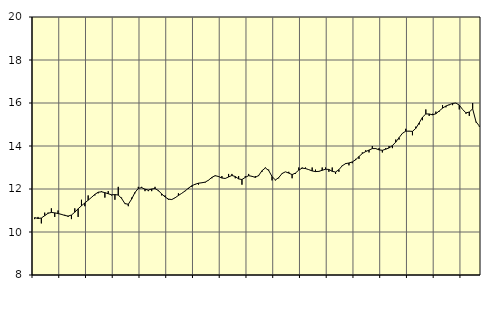
| Category | Piggar | Utbildning, SNI 85 |
|---|---|---|
| nan | 10.6 | 10.67 |
| 87.0 | 10.7 | 10.63 |
| 87.0 | 10.4 | 10.65 |
| 87.0 | 10.9 | 10.76 |
| nan | 10.9 | 10.87 |
| 88.0 | 11.1 | 10.91 |
| 88.0 | 10.7 | 10.89 |
| 88.0 | 11 | 10.86 |
| nan | 10.8 | 10.82 |
| 89.0 | 10.8 | 10.77 |
| 89.0 | 10.7 | 10.74 |
| 89.0 | 10.6 | 10.79 |
| nan | 11.1 | 10.92 |
| 90.0 | 10.7 | 11.08 |
| 90.0 | 11.5 | 11.22 |
| 90.0 | 11.2 | 11.35 |
| nan | 11.7 | 11.48 |
| 91.0 | 11.6 | 11.61 |
| 91.0 | 11.7 | 11.75 |
| 91.0 | 11.8 | 11.85 |
| nan | 11.9 | 11.87 |
| 92.0 | 11.6 | 11.83 |
| 92.0 | 11.9 | 11.78 |
| 92.0 | 11.7 | 11.73 |
| nan | 11.5 | 11.74 |
| 93.0 | 12.1 | 11.72 |
| 93.0 | 11.6 | 11.56 |
| 93.0 | 11.3 | 11.32 |
| nan | 11.2 | 11.29 |
| 94.0 | 11.6 | 11.53 |
| 94.0 | 11.8 | 11.84 |
| 94.0 | 12.1 | 12.03 |
| nan | 12.1 | 12.06 |
| 95.0 | 11.9 | 11.99 |
| 95.0 | 11.9 | 11.95 |
| 95.0 | 11.9 | 12 |
| nan | 12.1 | 12.02 |
| 96.0 | 11.9 | 11.93 |
| 96.0 | 11.7 | 11.77 |
| 96.0 | 11.7 | 11.63 |
| nan | 11.5 | 11.53 |
| 97.0 | 11.5 | 11.51 |
| 97.0 | 11.6 | 11.59 |
| 97.0 | 11.8 | 11.7 |
| nan | 11.8 | 11.8 |
| 98.0 | 11.9 | 11.91 |
| 98.0 | 12 | 12.04 |
| 98.0 | 12.1 | 12.15 |
| nan | 12.2 | 12.22 |
| 99.0 | 12.2 | 12.27 |
| 99.0 | 12.3 | 12.29 |
| 99.0 | 12.3 | 12.32 |
| nan | 12.4 | 12.41 |
| 0.0 | 12.5 | 12.54 |
| 0.0 | 12.6 | 12.62 |
| 0.0 | 12.6 | 12.58 |
| nan | 12.6 | 12.51 |
| 1.0 | 12.5 | 12.49 |
| 1.0 | 12.7 | 12.56 |
| 1.0 | 12.7 | 12.63 |
| nan | 12.5 | 12.58 |
| 2.0 | 12.6 | 12.47 |
| 2.0 | 12.2 | 12.44 |
| 2.0 | 12.6 | 12.54 |
| nan | 12.7 | 12.62 |
| 3.0 | 12.6 | 12.59 |
| 3.0 | 12.6 | 12.54 |
| 3.0 | 12.6 | 12.63 |
| nan | 12.8 | 12.85 |
| 4.0 | 13 | 12.98 |
| 4.0 | 12.9 | 12.86 |
| 4.0 | 12.4 | 12.58 |
| nan | 12.4 | 12.42 |
| 5.0 | 12.5 | 12.53 |
| 5.0 | 12.7 | 12.72 |
| 5.0 | 12.8 | 12.8 |
| nan | 12.8 | 12.74 |
| 6.0 | 12.5 | 12.67 |
| 6.0 | 12.7 | 12.74 |
| 6.0 | 13 | 12.88 |
| nan | 13 | 12.97 |
| 7.0 | 13 | 12.95 |
| 7.0 | 12.9 | 12.9 |
| 7.0 | 13 | 12.84 |
| nan | 12.9 | 12.81 |
| 8.0 | 12.8 | 12.82 |
| 8.0 | 13 | 12.87 |
| 8.0 | 13 | 12.92 |
| nan | 12.8 | 12.91 |
| 9.0 | 13 | 12.82 |
| 9.0 | 12.7 | 12.79 |
| 9.0 | 12.8 | 12.9 |
| nan | 13.1 | 13.08 |
| 10.0 | 13.2 | 13.18 |
| 10.0 | 13.1 | 13.21 |
| 10.0 | 13.2 | 13.26 |
| nan | 13.4 | 13.36 |
| 11.0 | 13.4 | 13.51 |
| 11.0 | 13.7 | 13.65 |
| 11.0 | 13.8 | 13.74 |
| nan | 13.7 | 13.81 |
| 12.0 | 14 | 13.88 |
| 12.0 | 13.9 | 13.88 |
| 12.0 | 13.9 | 13.82 |
| nan | 13.7 | 13.8 |
| 13.0 | 13.9 | 13.85 |
| 13.0 | 14 | 13.91 |
| 13.0 | 13.9 | 14.02 |
| nan | 14.3 | 14.18 |
| 14.0 | 14.3 | 14.39 |
| 14.0 | 14.6 | 14.59 |
| 14.0 | 14.8 | 14.69 |
| nan | 14.7 | 14.69 |
| 15.0 | 14.5 | 14.68 |
| 15.0 | 14.9 | 14.82 |
| 15.0 | 15 | 15.07 |
| nan | 15.2 | 15.34 |
| 16.0 | 15.7 | 15.49 |
| 16.0 | 15.4 | 15.49 |
| 16.0 | 15.5 | 15.45 |
| nan | 15.6 | 15.5 |
| 17.0 | 15.6 | 15.63 |
| 17.0 | 15.9 | 15.76 |
| 17.0 | 15.8 | 15.86 |
| nan | 15.9 | 15.92 |
| 18.0 | 15.9 | 15.98 |
| 18.0 | 16 | 16 |
| 18.0 | 15.7 | 15.9 |
| nan | 15.7 | 15.7 |
| 19.0 | 15.5 | 15.54 |
| 19.0 | 15.4 | 15.58 |
| 19.0 | 16 | 15.73 |
| nan | 15.1 | 15.13 |
| 20.0 | 14.9 | 14.93 |